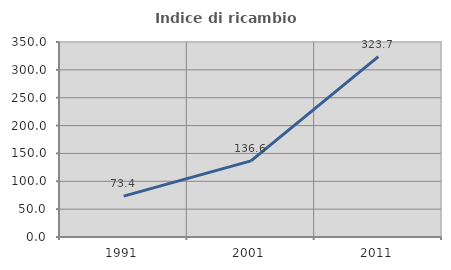
| Category | Indice di ricambio occupazionale  |
|---|---|
| 1991.0 | 73.389 |
| 2001.0 | 136.562 |
| 2011.0 | 323.723 |